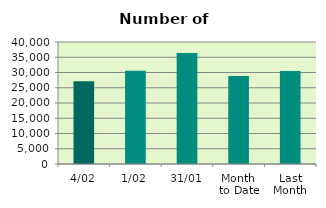
| Category | Series 0 |
|---|---|
| 4/02 | 27142 |
| 1/02 | 30592 |
| 31/01 | 36364 |
| Month 
to Date | 28867 |
| Last
Month | 30462.455 |